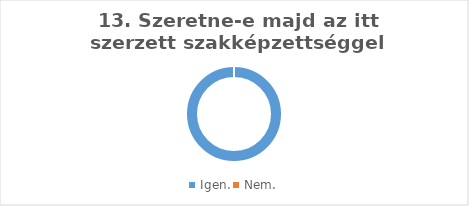
| Category | Series 0 |
|---|---|
| Igen. | 1 |
| Nem. | 0 |